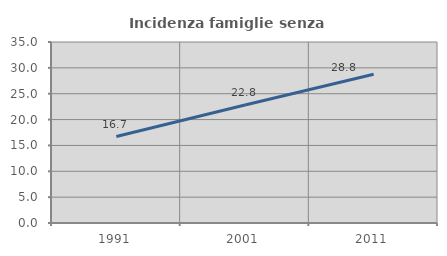
| Category | Incidenza famiglie senza nuclei |
|---|---|
| 1991.0 | 16.711 |
| 2001.0 | 22.819 |
| 2011.0 | 28.767 |